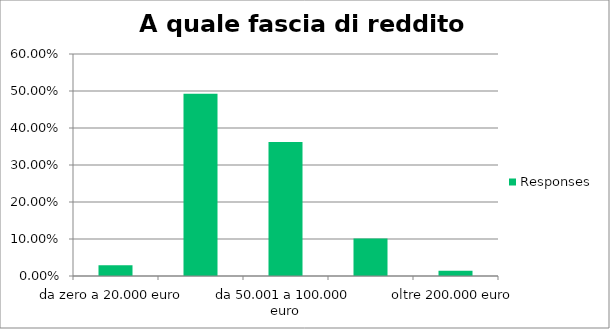
| Category | Responses |
|---|---|
| da zero a 20.000 euro | 0.029 |
| da 20.001 a 50.000 euro | 0.493 |
| da 50.001 a 100.000 euro | 0.362 |
| da 100.001 a 200.000 euro | 0.101 |
| oltre 200.000 euro | 0.014 |